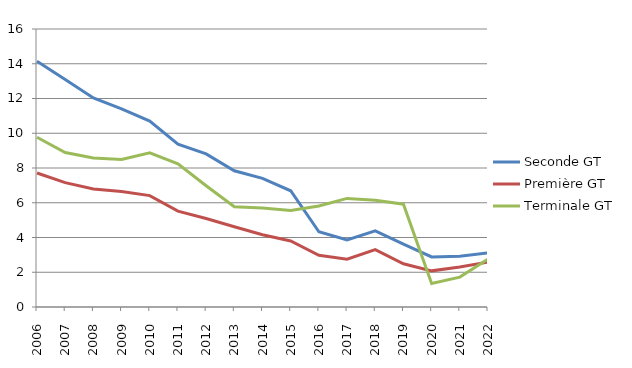
| Category | Seconde GT | Première GT | Terminale GT |
|---|---|---|---|
| 2006.0 | 14.14 | 7.71 | 9.77 |
| 2007.0 | 13.09 | 7.16 | 8.89 |
| 2008.0 | 12.03 | 6.79 | 8.58 |
| 2009.0 | 11.4 | 6.65 | 8.49 |
| 2010.0 | 10.7 | 6.41 | 8.87 |
| 2011.0 | 9.37 | 5.52 | 8.24 |
| 2012.0 | 8.81 | 5.09 | 6.98 |
| 2013.0 | 7.84 | 4.62 | 5.77 |
| 2014.0 | 7.4 | 4.16 | 5.7 |
| 2015.0 | 6.69 | 3.8 | 5.56 |
| 2016.0 | 4.33 | 2.98 | 5.81 |
| 2017.0 | 3.86 | 2.75 | 6.25 |
| 2018.0 | 4.38 | 3.3 | 6.14 |
| 2019.0 | 3.62 | 2.49 | 5.92 |
| 2020.0 | 2.88 | 2.08 | 1.35 |
| 2021.0 | 2.92 | 2.3 | 1.72 |
| 2022.0 | 3.11 | 2.59 | 2.76 |